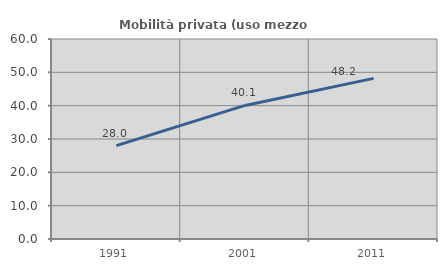
| Category | Mobilità privata (uso mezzo privato) |
|---|---|
| 1991.0 | 28.024 |
| 2001.0 | 40.076 |
| 2011.0 | 48.188 |